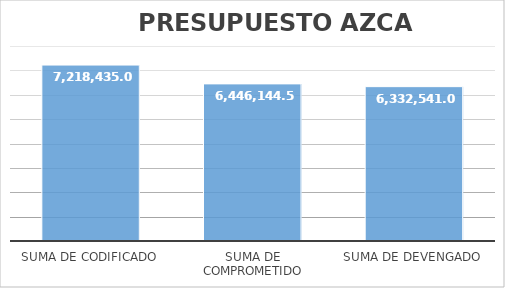
| Category | Series 0 |
|---|---|
| Suma de Codificado | 7218435.03 |
| Suma de Comprometido | 6446144.54 |
| Suma de Devengado | 6332541.02 |